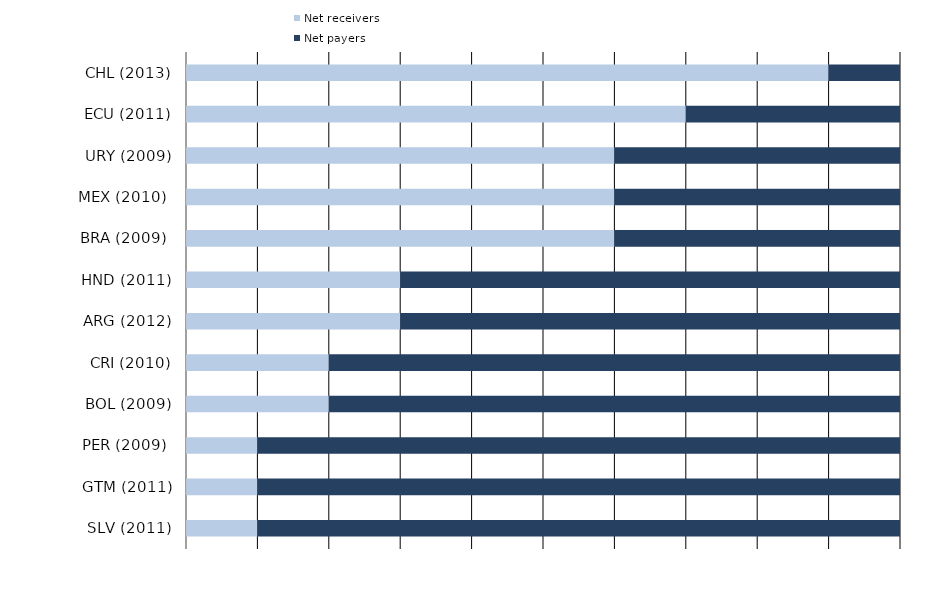
| Category | Net receivers | Net payers |
|---|---|---|
| SLV (2011) | 1 | 9 |
| GTM (2011) | 1 | 9 |
| PER (2009)  | 1 | 9 |
| BOL (2009) | 2 | 8 |
| CRI (2010) | 2 | 8 |
| ARG (2012) | 3 | 7 |
| HND (2011) | 3 | 7 |
| BRA (2009)  | 6 | 4 |
| MEX (2010)  | 6 | 4 |
| URY (2009) | 6 | 4 |
| ECU (2011) | 7 | 3 |
| CHL (2013) | 9 | 1 |